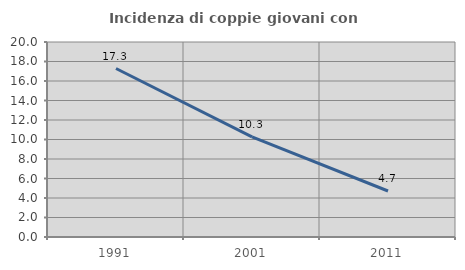
| Category | Incidenza di coppie giovani con figli |
|---|---|
| 1991.0 | 17.282 |
| 2001.0 | 10.276 |
| 2011.0 | 4.719 |